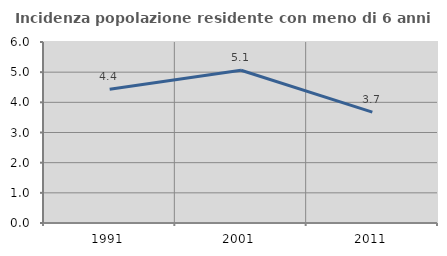
| Category | Incidenza popolazione residente con meno di 6 anni |
|---|---|
| 1991.0 | 4.43 |
| 2001.0 | 5.063 |
| 2011.0 | 3.676 |